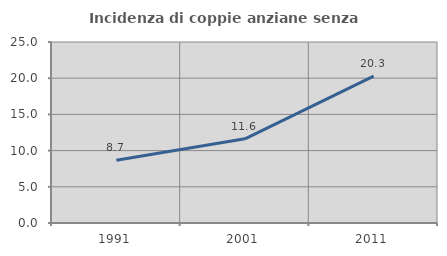
| Category | Incidenza di coppie anziane senza figli  |
|---|---|
| 1991.0 | 8.654 |
| 2001.0 | 11.628 |
| 2011.0 | 20.29 |